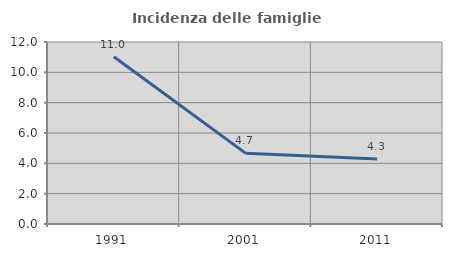
| Category | Incidenza delle famiglie numerose |
|---|---|
| 1991.0 | 11.028 |
| 2001.0 | 4.673 |
| 2011.0 | 4.294 |